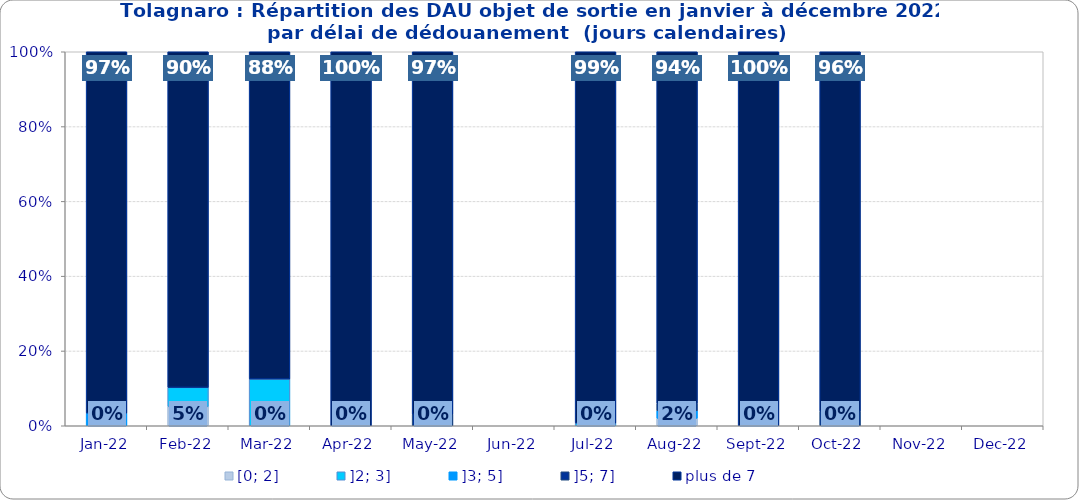
| Category | [0; 2] | ]2; 3] | ]3; 5] | ]5; 7] | plus de 7 |
|---|---|---|---|---|---|
| 2022-01-01 | 0 | 0 | 0.034 | 0 | 0.966 |
| 2022-02-01 | 0.051 | 0.051 | 0 | 0 | 0.897 |
| 2022-03-01 | 0 | 0.125 | 0 | 0 | 0.875 |
| 2022-04-01 | 0 | 0 | 0 | 0 | 1 |
| 2022-05-01 | 0 | 0 | 0 | 0.031 | 0.969 |
| 2022-06-01 | 0 | 0 | 0 | 0 | 0 |
| 2022-07-01 | 0 | 0.007 | 0 | 0 | 0.993 |
| 2022-08-01 | 0.02 | 0 | 0.02 | 0.02 | 0.94 |
| 2022-09-01 | 0 | 0 | 0 | 0 | 1 |
| 2022-10-01 | 0 | 0 | 0 | 0.039 | 0.961 |
| 2022-11-01 | 0 | 0 | 0 | 0 | 0 |
| 2022-12-01 | 0 | 0 | 0 | 0 | 0 |